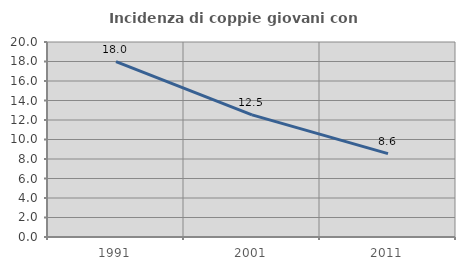
| Category | Incidenza di coppie giovani con figli |
|---|---|
| 1991.0 | 17.979 |
| 2001.0 | 12.526 |
| 2011.0 | 8.552 |